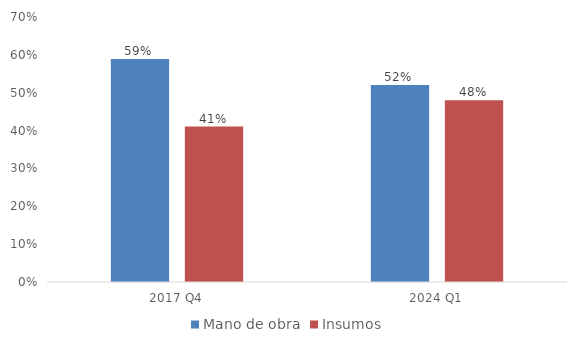
| Category | Mano de obra | Insumos |
|---|---|---|
| 2017 Q4 | 0.589 | 0.411 |
| 2024 Q1 | 0.52 | 0.48 |